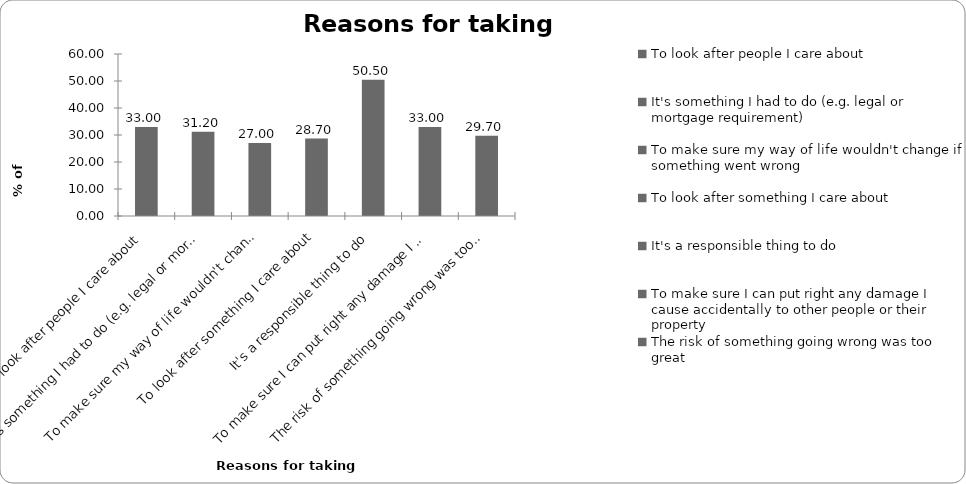
| Category | Reasons for taking insurance |
|---|---|
| To look after people I care about | 33 |
| It's something I had to do (e.g. legal or mortgage requirement) | 31.2 |
| To make sure my way of life wouldn't change if something went wrong | 27 |
| To look after something I care about | 28.7 |
| It's a responsible thing to do | 50.5 |
| To make sure I can put right any damage I cause accidentally to other people or their property | 33 |
| The risk of something going wrong was too great | 29.7 |